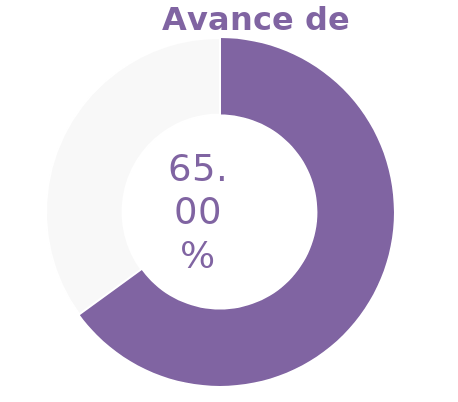
| Category | Series 0 |
|---|---|
| Acumulado 1 Trimestre | 0.65 |
| Año | -0.35 |